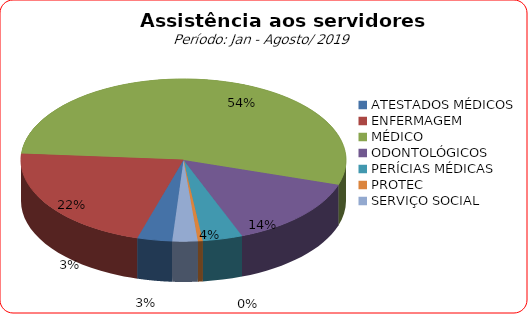
| Category | Series 0 |
|---|---|
| ATESTADOS MÉDICOS | 3.46 |
| ENFERMAGEM | 21.621 |
| MÉDICO | 53.739 |
| ODONTOLÓGICOS | 14.213 |
| PERÍCIAS MÉDICAS | 3.971 |
| PROTEC | 0.488 |
| SERVIÇO SOCIAL | 2.508 |